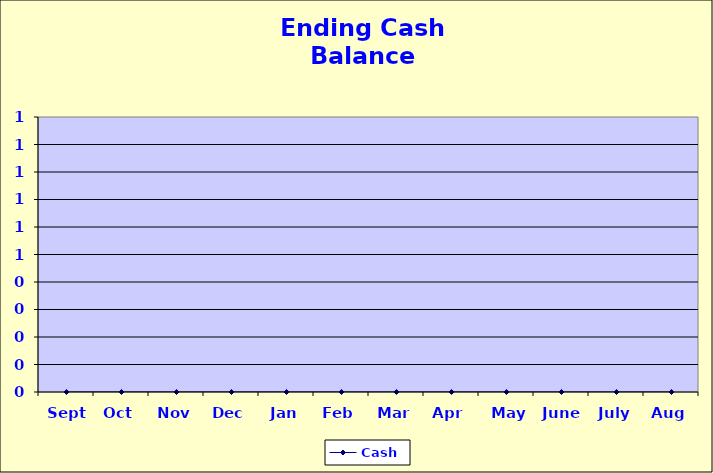
| Category | Cash  |
|---|---|
| Sept | 0 |
| Oct | 0 |
| Nov | 0 |
| Dec | 0 |
| Jan | 0 |
| Feb | 0 |
| Mar | 0 |
| Apr | 0 |
| May | 0 |
| June | 0 |
| July | 0 |
| Aug | 0 |